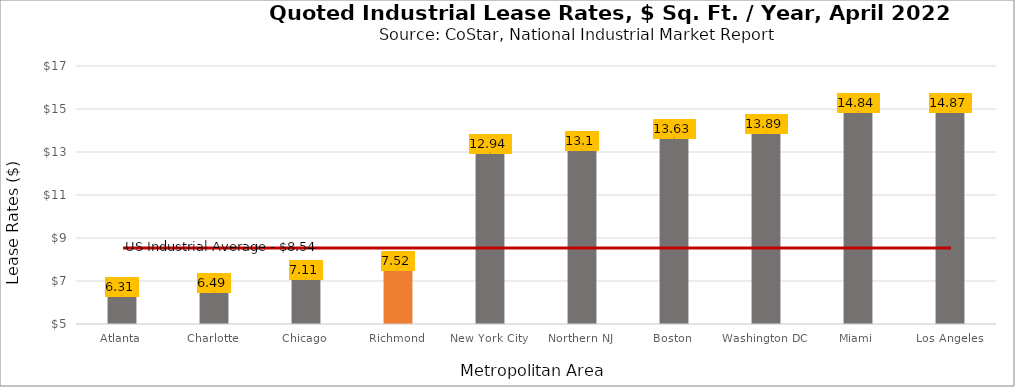
| Category | Series 0 |
|---|---|
| Atlanta | 6.31 |
| Charlotte | 6.49 |
| Chicago | 7.11 |
| Richmond | 7.52 |
| New York City | 12.94 |
| Northern NJ | 13.1 |
| Boston | 13.63 |
| Washington DC | 13.89 |
| Miami | 14.84 |
| Los Angeles | 14.87 |